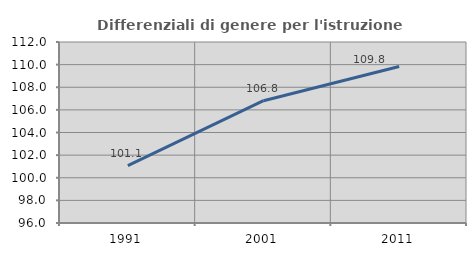
| Category | Differenziali di genere per l'istruzione superiore |
|---|---|
| 1991.0 | 101.067 |
| 2001.0 | 106.811 |
| 2011.0 | 109.839 |